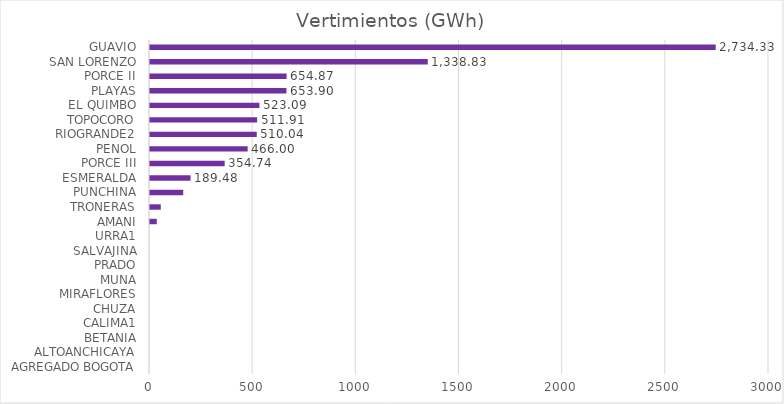
| Category | Vertimientos (GWh) |
|---|---|
| AGREGADO BOGOTA | 0 |
| ALTOANCHICAYA | 0 |
| BETANIA | 0 |
| CALIMA1 | 0 |
| CHUZA | 0 |
| MIRAFLORES | 0 |
| MUNA | 0 |
| PRADO | 0 |
| SALVAJINA | 0 |
| URRA1 | 0 |
| AMANI | 25.47 |
| TRONERAS | 44.903 |
| PUNCHINA | 153.77 |
| ESMERALDA | 189.485 |
| PORCE III | 354.743 |
| PENOL | 465.995 |
| RIOGRANDE2 | 510.039 |
| TOPOCORO | 511.91 |
| EL QUIMBO | 523.087 |
| PLAYAS | 653.896 |
| PORCE II | 654.875 |
| SAN LORENZO | 1338.828 |
| GUAVIO | 2734.332 |